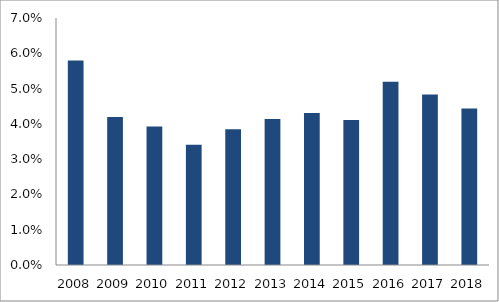
| Category | Series 0 |
|---|---|
| 2008.0 | 0.058 |
| 2009.0 | 0.042 |
| 2010.0 | 0.039 |
| 2011.0 | 0.034 |
| 2012.0 | 0.038 |
| 2013.0 | 0.041 |
| 2014.0 | 0.043 |
| 2015.0 | 0.041 |
| 2016.0 | 0.052 |
| 2017.0 | 0.048 |
| 2018.0 | 0.044 |